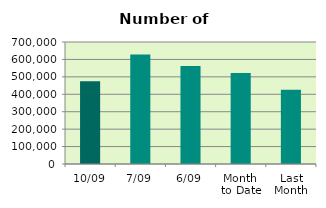
| Category | Series 0 |
|---|---|
| 10/09 | 475166 |
| 7/09 | 627598 |
| 6/09 | 562652 |
| Month 
to Date | 521705 |
| Last
Month | 425540 |